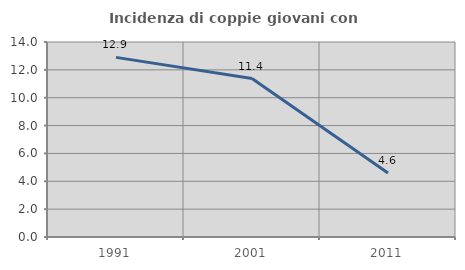
| Category | Incidenza di coppie giovani con figli |
|---|---|
| 1991.0 | 12.895 |
| 2001.0 | 11.374 |
| 2011.0 | 4.592 |